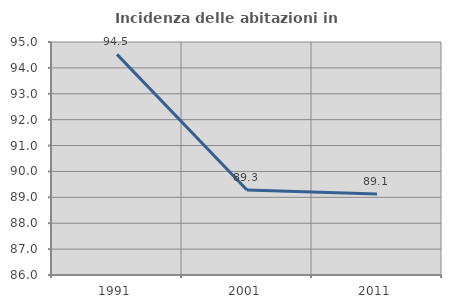
| Category | Incidenza delle abitazioni in proprietà  |
|---|---|
| 1991.0 | 94.522 |
| 2001.0 | 89.281 |
| 2011.0 | 89.133 |